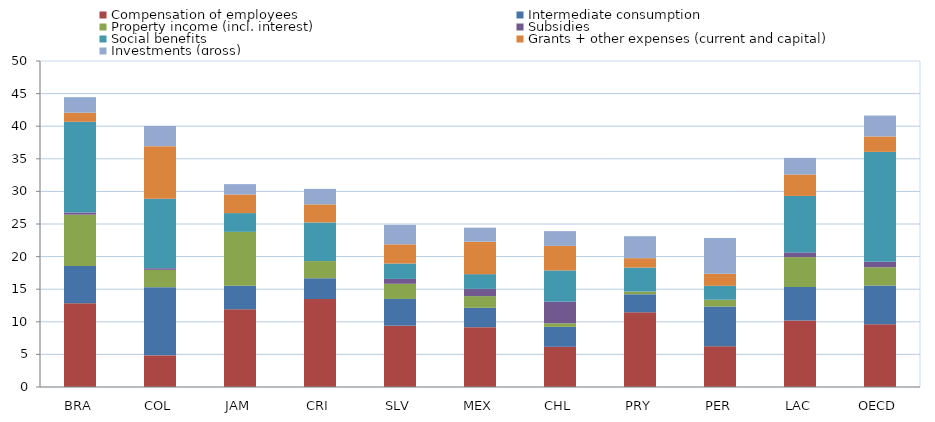
| Category | Compensation of employees | Intermediate consumption | Property income (incl. interest) | Subsidies | Social benefits | Grants + other expenses (current and capital) | Investments (gross) |
|---|---|---|---|---|---|---|---|
| BRA | 12.853 | 5.708 | 7.864 | 0.342 | 13.909 | 1.388 | 2.387 |
| COL | 4.854 | 10.453 | 2.661 | 0.248 | 10.652 | 8.074 | 3.1 |
| JAM | 11.924 | 3.609 | 8.269 | 0 | 2.869 | 2.862 | 1.579 |
| CRI | 13.495 | 3.185 | 2.637 | 0 | 5.919 | 2.775 | 2.374 |
| SLV | 9.402 | 4.103 | 2.321 | 0.757 | 2.356 | 2.942 | 2.986 |
| MEX | 9.18 | 2.974 | 1.783 | 1.112 | 2.262 | 4.979 | 2.148 |
| CHL | 6.165 | 3.057 | 0.549 | 3.313 | 4.798 | 3.76 | 2.266 |
| PRY | 11.457 | 2.765 | 0.39 | 0.033 | 3.674 | 1.439 | 3.37 |
| PER | 6.241 | 6.097 | 1.052 | 0 | 2.126 | 1.848 | 5.499 |
| LAC | 10.211 | 5.129 | 4.583 | 0.72 | 8.661 | 3.287 | 2.556 |
| OECD | 9.607 | 5.947 | 2.811 | 0.84 | 16.861 | 2.361 | 3.207 |